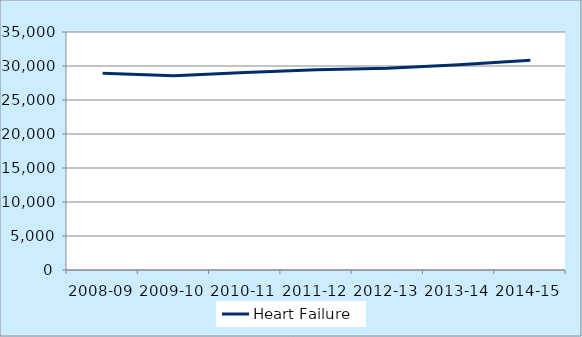
| Category | Heart Failure  |
|---|---|
| 2008-09 | 28932 |
| 2009-10 | 28549 |
| 2010-11 | 29029 |
| 2011-12 | 29454 |
| 2012-13 | 29658 |
| 2013-14 | 30187 |
| 2014-15 | 30859 |